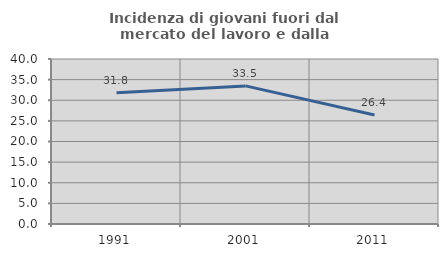
| Category | Incidenza di giovani fuori dal mercato del lavoro e dalla formazione  |
|---|---|
| 1991.0 | 31.79 |
| 2001.0 | 33.48 |
| 2011.0 | 26.419 |